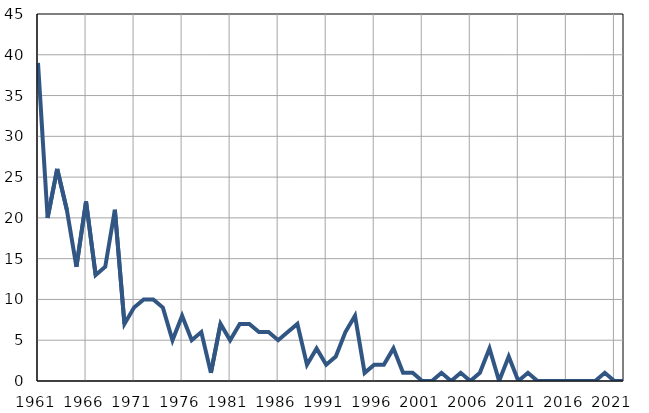
| Category | Infants
deaths |
|---|---|
| 1961.0 | 39 |
| 1962.0 | 20 |
| 1963.0 | 26 |
| 1964.0 | 21 |
| 1965.0 | 14 |
| 1966.0 | 22 |
| 1967.0 | 13 |
| 1968.0 | 14 |
| 1969.0 | 21 |
| 1970.0 | 7 |
| 1971.0 | 9 |
| 1972.0 | 10 |
| 1973.0 | 10 |
| 1974.0 | 9 |
| 1975.0 | 5 |
| 1976.0 | 8 |
| 1977.0 | 5 |
| 1978.0 | 6 |
| 1979.0 | 1 |
| 1980.0 | 7 |
| 1981.0 | 5 |
| 1982.0 | 7 |
| 1983.0 | 7 |
| 1984.0 | 6 |
| 1985.0 | 6 |
| 1986.0 | 5 |
| 1987.0 | 6 |
| 1988.0 | 7 |
| 1989.0 | 2 |
| 1990.0 | 4 |
| 1991.0 | 2 |
| 1992.0 | 3 |
| 1993.0 | 6 |
| 1994.0 | 8 |
| 1995.0 | 1 |
| 1996.0 | 2 |
| 1997.0 | 2 |
| 1998.0 | 4 |
| 1999.0 | 1 |
| 2000.0 | 1 |
| 2001.0 | 0 |
| 2002.0 | 0 |
| 2003.0 | 1 |
| 2004.0 | 0 |
| 2005.0 | 1 |
| 2006.0 | 0 |
| 2007.0 | 1 |
| 2008.0 | 4 |
| 2009.0 | 0 |
| 2010.0 | 3 |
| 2011.0 | 0 |
| 2012.0 | 1 |
| 2013.0 | 0 |
| 2014.0 | 0 |
| 2015.0 | 0 |
| 2016.0 | 0 |
| 2017.0 | 0 |
| 2018.0 | 0 |
| 2019.0 | 0 |
| 2020.0 | 1 |
| 2021.0 | 0 |
| 2022.0 | 0 |